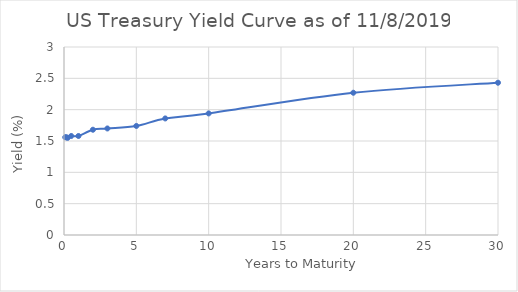
| Category | 11/8/2019 |
|---|---|
| 0.08333333333333333 | 1.56 |
| 0.16666666666666666 | 1.56 |
| 0.25 | 1.55 |
| 0.5 | 1.58 |
| 1.0 | 1.58 |
| 2.0 | 1.68 |
| 3.0 | 1.7 |
| 5.0 | 1.74 |
| 7.0 | 1.86 |
| 10.0 | 1.94 |
| 20.0 | 2.27 |
| 30.0 | 2.43 |